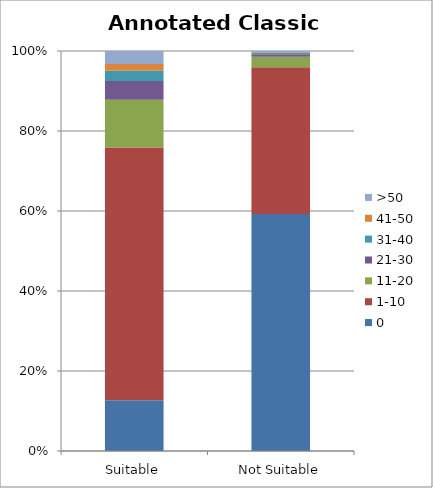
| Category | 0 | 1-10 | 11-20 | 21-30 | 31-40 | 41-50 | >50 |
|---|---|---|---|---|---|---|---|
| Suitable | 734 | 3658 | 690 | 270 | 150 | 98 | 187 |
| Not Suitable | 4826 | 2985 | 216 | 49 | 25 | 17 | 26 |